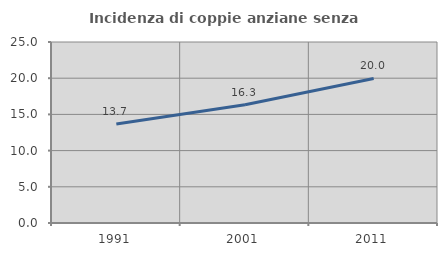
| Category | Incidenza di coppie anziane senza figli  |
|---|---|
| 1991.0 | 13.676 |
| 2001.0 | 16.321 |
| 2011.0 | 19.966 |